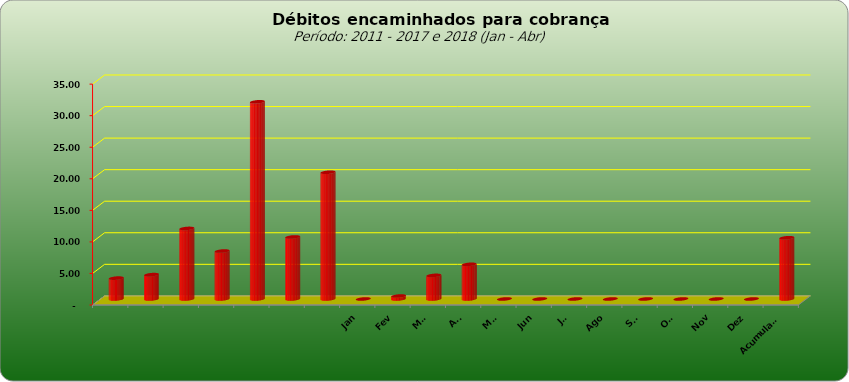
| Category |  3.309.443,02  |
|---|---|
|  | 3309443.02 |
|  | 3859728.44 |
|  | 11181928.25 |
|  | 7600526.01 |
|  | 31248623.5 |
|  | 9830198.34 |
|  | 20083556.95 |
| Jan | 0 |
| Fev | 468831.1 |
| Mar | 3741527.45 |
| Abr | 5493663.59 |
| Mai | 0 |
| Jun | 0 |
| Jul | 0 |
| Ago | 0 |
| Set | 0 |
| Out | 0 |
| Nov | 0 |
| Dez | 0 |
| Acumulado | 9704022.14 |